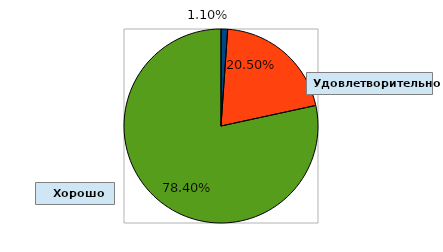
| Category | Series 0 |
|---|---|
| 0 | 0.011 |
| 1 | 0.205 |
| 2 | 0.784 |